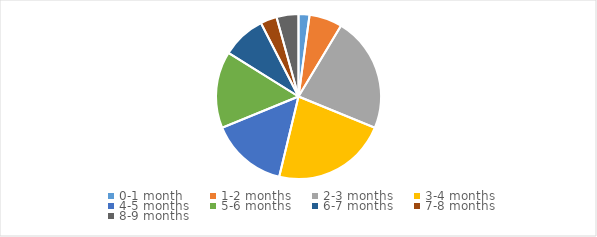
| Category | Series 0 |
|---|---|
| 0-1 month | 0.022 |
| 1-2 months | 0.065 |
| 2-3 months | 0.226 |
| 3-4 months | 0.226 |
| 4-5 months | 0.151 |
| 5-6 months | 0.151 |
| 6-7 months | 0.086 |
| 7-8 months | 0.032 |
| 8-9 months | 0.043 |